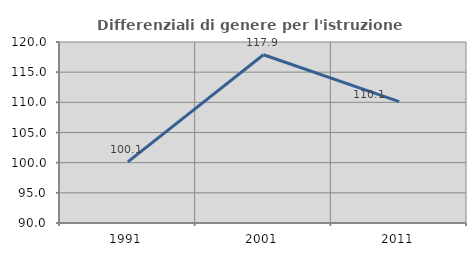
| Category | Differenziali di genere per l'istruzione superiore |
|---|---|
| 1991.0 | 100.14 |
| 2001.0 | 117.886 |
| 2011.0 | 110.123 |